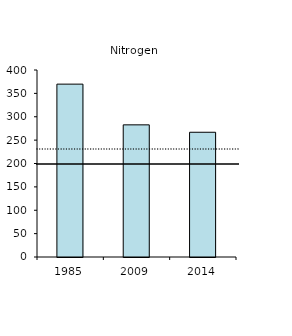
| Category | Series 0 |
|---|---|
| 1985.0 | 369.782 |
| 2009.0 | 282.662 |
| 2014.0 | 266.833 |